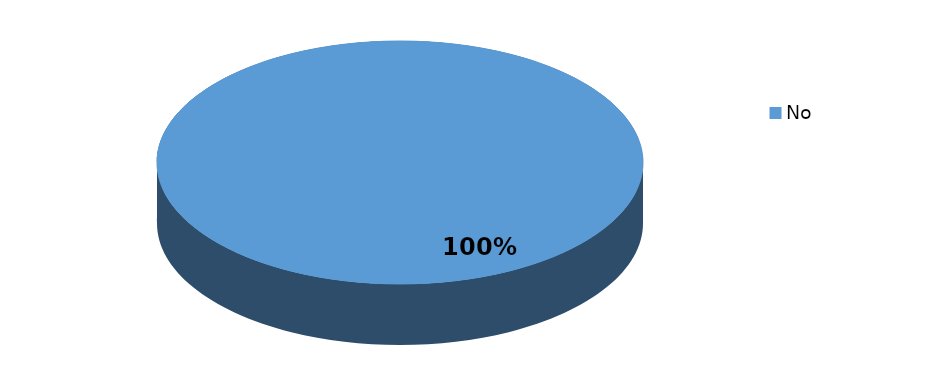
| Category | Frecuencia |
|---|---|
| No | 13 |